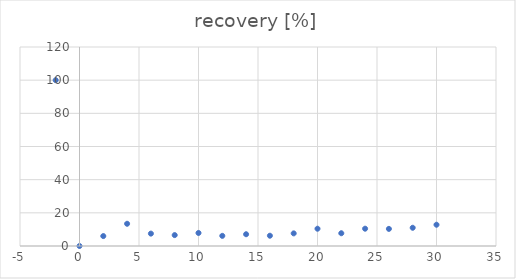
| Category | recovery [%] |
|---|---|
| -2.0 | 100 |
| 0.0 | 0 |
| 2.0 | 5.988 |
| 4.0 | 13.406 |
| 6.0 | 7.47 |
| 8.0 | 6.572 |
| 10.0 | 7.865 |
| 12.0 | 6.116 |
| 14.0 | 7.091 |
| 16.0 | 6.198 |
| 18.0 | 7.615 |
| 20.0 | 10.422 |
| 22.0 | 7.699 |
| 24.0 | 10.438 |
| 26.0 | 10.322 |
| 28.0 | 10.995 |
| 30.0 | 12.822 |